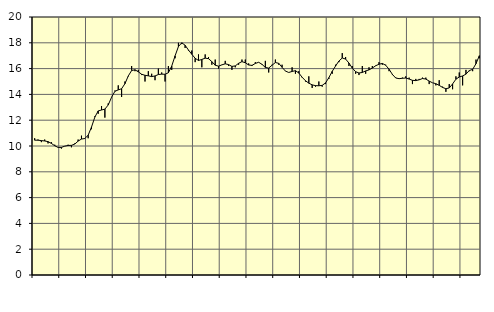
| Category | Piggar | Series 1 |
|---|---|---|
| nan | 10.6 | 10.45 |
| 87.0 | 10.5 | 10.45 |
| 87.0 | 10.3 | 10.42 |
| 87.0 | 10.5 | 10.39 |
| nan | 10.2 | 10.34 |
| 88.0 | 10.3 | 10.2 |
| 88.0 | 10.1 | 10.02 |
| 88.0 | 9.9 | 9.89 |
| nan | 9.8 | 9.89 |
| 89.0 | 10 | 9.99 |
| 89.0 | 10.1 | 10.04 |
| 89.0 | 9.9 | 10.05 |
| nan | 10.2 | 10.15 |
| 90.0 | 10.5 | 10.38 |
| 90.0 | 10.8 | 10.54 |
| 90.0 | 10.6 | 10.58 |
| nan | 10.6 | 10.84 |
| 91.0 | 11.3 | 11.47 |
| 91.0 | 12.3 | 12.24 |
| 91.0 | 12.5 | 12.72 |
| nan | 13.1 | 12.79 |
| 92.0 | 12.2 | 12.86 |
| 92.0 | 13.3 | 13.18 |
| 92.0 | 13.8 | 13.78 |
| nan | 14.3 | 14.24 |
| 93.0 | 14.7 | 14.35 |
| 93.0 | 13.8 | 14.44 |
| 93.0 | 15 | 14.83 |
| nan | 15.4 | 15.43 |
| 94.0 | 16.2 | 15.85 |
| 94.0 | 15.8 | 15.91 |
| 94.0 | 15.9 | 15.75 |
| nan | 15.5 | 15.56 |
| 95.0 | 15 | 15.48 |
| 95.0 | 15.8 | 15.44 |
| 95.0 | 15.6 | 15.38 |
| nan | 15.1 | 15.43 |
| 96.0 | 16 | 15.54 |
| 96.0 | 15.7 | 15.57 |
| 96.0 | 15 | 15.56 |
| nan | 16.2 | 15.68 |
| 97.0 | 15.9 | 16.2 |
| 97.0 | 16.8 | 16.99 |
| 97.0 | 18 | 17.71 |
| nan | 17.9 | 18 |
| 98.0 | 17.6 | 17.81 |
| 98.0 | 17.4 | 17.44 |
| 98.0 | 17.4 | 17.11 |
| nan | 16.5 | 16.8 |
| 99.0 | 17.1 | 16.63 |
| 99.0 | 16.1 | 16.71 |
| 99.0 | 17.1 | 16.81 |
| nan | 16.9 | 16.77 |
| 0.0 | 16.3 | 16.54 |
| 0.0 | 16.7 | 16.26 |
| 0.0 | 16 | 16.19 |
| nan | 16.3 | 16.29 |
| 1.0 | 16.6 | 16.37 |
| 1.0 | 16.2 | 16.31 |
| 1.0 | 15.9 | 16.17 |
| nan | 16.1 | 16.21 |
| 2.0 | 16.3 | 16.41 |
| 2.0 | 16.7 | 16.54 |
| 2.0 | 16.7 | 16.45 |
| nan | 16.4 | 16.28 |
| 3.0 | 16.2 | 16.25 |
| 3.0 | 16.5 | 16.4 |
| 3.0 | 16.5 | 16.49 |
| nan | 16.3 | 16.33 |
| 4.0 | 16.6 | 16.09 |
| 4.0 | 15.7 | 16.04 |
| 4.0 | 16.3 | 16.26 |
| nan | 16.7 | 16.47 |
| 5.0 | 16.3 | 16.41 |
| 5.0 | 16.3 | 16.1 |
| 5.0 | 15.8 | 15.81 |
| nan | 15.7 | 15.7 |
| 6.0 | 16.1 | 15.78 |
| 6.0 | 15.6 | 15.84 |
| 6.0 | 15.8 | 15.66 |
| nan | 15.3 | 15.33 |
| 7.0 | 15 | 15.06 |
| 7.0 | 15.4 | 14.87 |
| 7.0 | 14.5 | 14.74 |
| nan | 14.6 | 14.68 |
| 8.0 | 15 | 14.67 |
| 8.0 | 14.6 | 14.7 |
| 8.0 | 14.8 | 14.89 |
| nan | 15.2 | 15.3 |
| 9.0 | 15.6 | 15.79 |
| 9.0 | 16.3 | 16.2 |
| 9.0 | 16.5 | 16.59 |
| nan | 17.2 | 16.82 |
| 10.0 | 16.9 | 16.74 |
| 10.0 | 16.2 | 16.43 |
| 10.0 | 16.2 | 16.04 |
| nan | 15.6 | 15.76 |
| 11.0 | 15.5 | 15.66 |
| 11.0 | 16.2 | 15.7 |
| 11.0 | 15.6 | 15.82 |
| nan | 16.1 | 15.9 |
| 12.0 | 16.2 | 16.04 |
| 12.0 | 16.2 | 16.22 |
| 12.0 | 16.5 | 16.34 |
| nan | 16.3 | 16.4 |
| 13.0 | 16.3 | 16.26 |
| 13.0 | 15.8 | 15.95 |
| 13.0 | 15.5 | 15.55 |
| nan | 15.3 | 15.27 |
| 14.0 | 15.2 | 15.22 |
| 14.0 | 15.3 | 15.25 |
| 14.0 | 15.4 | 15.27 |
| nan | 15.3 | 15.19 |
| 15.0 | 14.8 | 15.09 |
| 15.0 | 15.2 | 15.07 |
| 15.0 | 15.2 | 15.13 |
| nan | 15.3 | 15.23 |
| 16.0 | 15.3 | 15.19 |
| 16.0 | 14.8 | 15.03 |
| 16.0 | 14.9 | 14.9 |
| nan | 14.7 | 14.83 |
| 17.0 | 15.1 | 14.7 |
| 17.0 | 14.6 | 14.54 |
| 17.0 | 14.2 | 14.44 |
| nan | 14.8 | 14.5 |
| 18.0 | 14.4 | 14.81 |
| 18.0 | 15.4 | 15.18 |
| 18.0 | 15.7 | 15.35 |
| nan | 14.7 | 15.43 |
| 19.0 | 15.9 | 15.57 |
| 19.0 | 15.8 | 15.85 |
| 19.0 | 15.8 | 15.94 |
| nan | 16.7 | 16.38 |
| 20.0 | 16.8 | 17 |